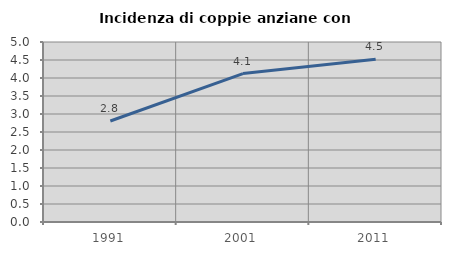
| Category | Incidenza di coppie anziane con figli |
|---|---|
| 1991.0 | 2.806 |
| 2001.0 | 4.124 |
| 2011.0 | 4.524 |